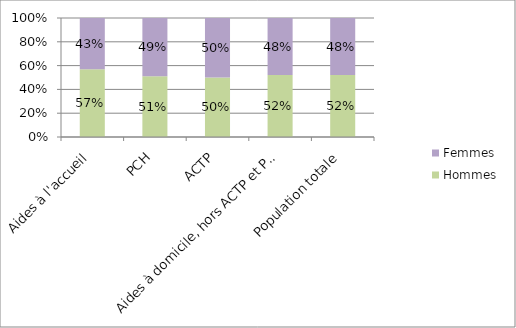
| Category | Hommes | Femmes |
|---|---|---|
| Aides à l'accueil | 0.57 | 0.43 |
| PCH | 0.51 | 0.49 |
| ACTP | 0.5 | 0.5 |
| Aides à domicile, hors ACTP et PCH | 0.52 | 0.48 |
| Population totale | 0.52 | 0.48 |